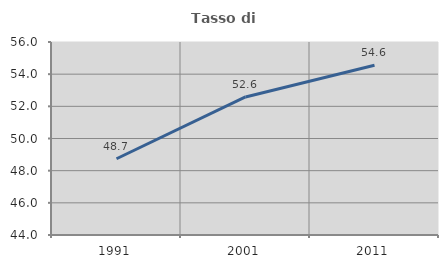
| Category | Tasso di occupazione   |
|---|---|
| 1991.0 | 48.742 |
| 2001.0 | 52.582 |
| 2011.0 | 54.551 |